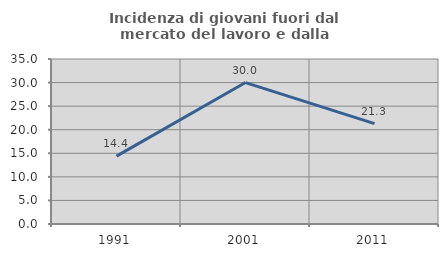
| Category | Incidenza di giovani fuori dal mercato del lavoro e dalla formazione  |
|---|---|
| 1991.0 | 14.398 |
| 2001.0 | 30 |
| 2011.0 | 21.285 |